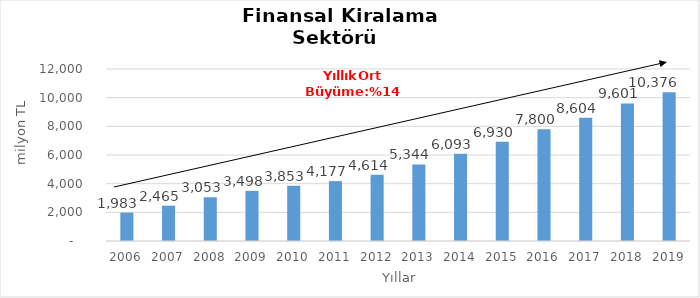
| Category | Finansal Kiralama  |
|---|---|
| 2006.0 | 1982.831 |
| 2007.0 | 2465.488 |
| 2008.0 | 3052.714 |
| 2009.0 | 3497.62 |
| 2010.0 | 3853.173 |
| 2011.0 | 4177.309 |
| 2012.0 | 4614.29 |
| 2013.0 | 5344.41 |
| 2014.0 | 6093 |
| 2015.0 | 6930 |
| 2016.0 | 7800 |
| 2017.0 | 8604 |
| 2018.0 | 9601 |
| 2019.0 | 10376 |